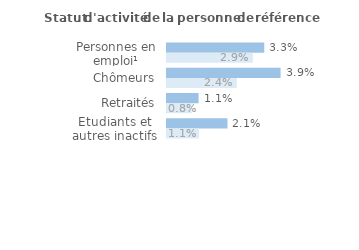
| Category | Series 1 | Series 0 |
|---|---|---|
| Personnes en emploi¹ | 0.033 | 0.029 |
| Chômeurs | 0.039 | 0.024 |
| Retraités | 0.011 | 0.008 |
| Etudiants et autres inactifs | 0.021 | 0.011 |